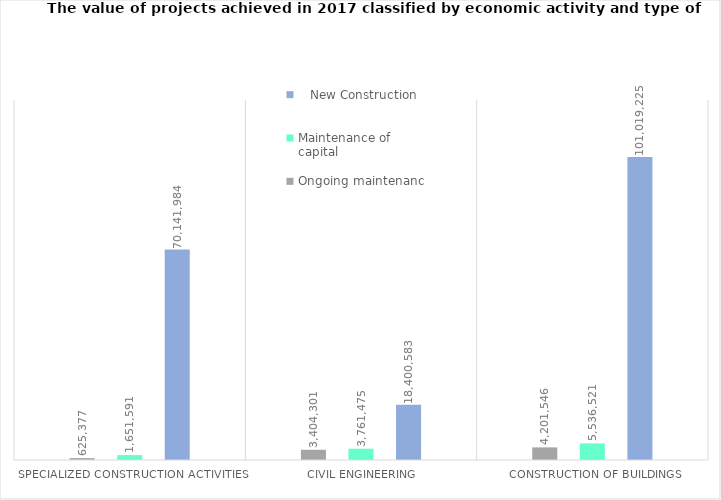
| Category |     New Construction  |  Maintenance of capital  |  Ongoing maintenance  |
|---|---|---|---|
|  Construction of buildings | 101019225.321 | 5536520.987 | 4201546.176 |
| Civil engineering | 18400582.891 | 3761474.66 | 3404300.825 |
| Specialized construction activities | 70141983.971 | 1651591.436 | 625377.48 |